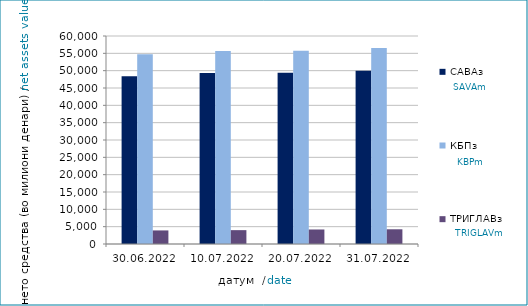
| Category | САВАз | КБПз | ТРИГЛАВз |
|---|---|---|---|
| 2022-06-30 | 48371.417 | 54753.666 | 3915.469 |
| 2022-07-10 | 49309.165 | 55703.17 | 3996.281 |
| 2022-07-20 | 49372.754 | 55709.373 | 4186.612 |
| 2022-07-31 | 49984.597 | 56510.527 | 4245.293 |